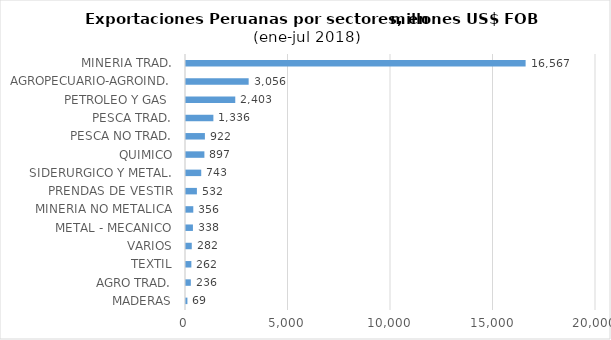
| Category | Series 0 |
|---|---|
| MADERAS | 68.736 |
| AGRO TRAD. | 235.887 |
| TEXTIL | 261.504 |
| VARIOS | 281.57 |
| METAL - MECANICO | 337.92 |
| MINERIA NO METALICA | 355.562 |
| PRENDAS DE VESTIR | 531.654 |
| SIDERURGICO Y METAL. | 742.92 |
| QUIMICO | 897.179 |
| PESCA NO TRAD. | 922.235 |
| PESCA TRAD. | 1335.757 |
| PETROLEO Y GAS  | 2403.062 |
| AGROPECUARIO-AGROIND. | 3056.453 |
| MINERIA TRAD. | 16566.628 |